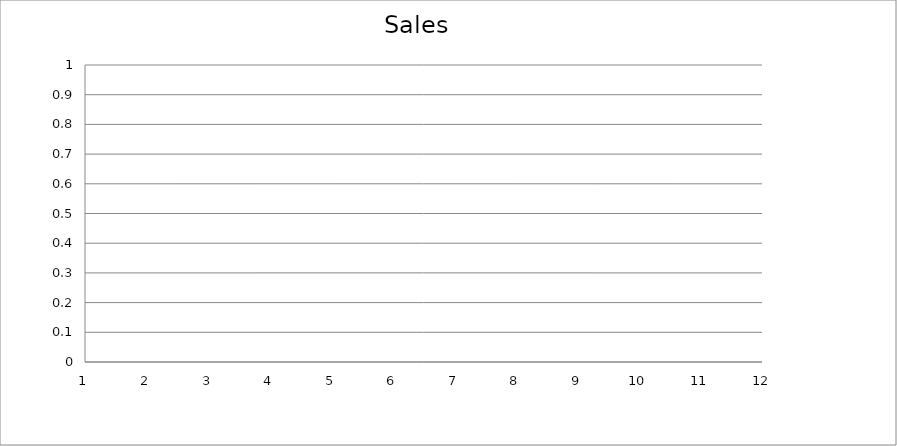
| Category | Actual |
|---|---|
| 0 | 3100 |
| 1 | 930 |
| 2 | 1530 |
| 3 | 1840 |
| 4 | 1920 |
| 5 | 3120 |
| 6 | 2730 |
| 7 | 980 |
| 8 | 620 |
| 9 | 2770 |
| 10 | 1410 |
| 11 | 1130 |